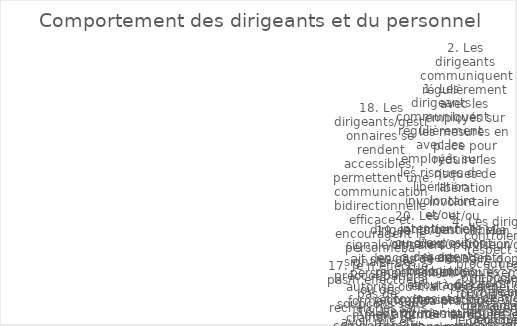
| Category | Series 0 |
|---|---|
| 1. Les dirigeants communiquent régulièrement avec les employés sur les risques de libération involontaire et/ou intentionnelle ou d’exposition à des agents biologiques et/ou à des toxines stockés ou manipulés dans mon installation. | 1 |
| 2. Les dirigeants communiquent régulièrement avec les employés sur les mesures en place pour réduire les risques de libération involontaire et/ou intentionnelle ou d’exposition à des agents biologiques et/ou à des toxines stockés ou manipulés dans mon ins | 5 |
| 3. Mon superviseur/gestionnaire donne un bon exemple personnel de pratiques visant à réduire les risques biologiques. | 5 |
| 4. Les dirigeants contrôlent le respect des procédures (ou protocoles de recherche) et des règles de conduite approuvées/validées. | 2 |
| 5. Les dirigeants fournissent les moyens nécessaires pour mettre en œuvre des mesures de biosécurité et de biosûreté. | 3 |
| 6. Les dirigeants de mon organisation encouragent les employés à accroître leur éducation et leur sensibilisation aux risques biologiques. | 0 |
| 7. Je suis convaincu que je peux déclarer moi-même une maladie ou d’autres conditions susceptibles d’affecter la biosécurité/biosûreté sans crainte de perdre mon emploi ni d’autres effets négatifs sur ma vie professionnelle/ma carrière.  | 2 |
| 8. Il n’est jamais approprié de suivre (« ferroutage ») un employé autorisé à entrer dans une zone réglementée. | 5 |
| 9. Je signale/signalerait un comportement inhabituel de mes collègues qui augmente le risque de libération involontaire et/ou intentionnelle d’agents biologiques et/ou de toxines, ou d’exposition à ces agents. | 5 |
| 10. Je suis engagé dans les processus d’évaluation des risques et de prise de décision pour réduire le risque de libération involontaire et/ou intentionnelle d’agents biologiques et/ou de toxines stockés ou manipulés dans mon installation. | 1 |
| 11. Mon organisation valorise la vigilance en matière de biosécurité et de biosûreté. | 1 |
| 12. Dans mon organisation, des mesures sont en place pour punir les violations délibérées de la biosécurité et de la biosûreté. | 2 |
| 13. Les dirigeants communiquent avec le personnel sur les attentes de performance spécifiques dans les domaines qui affectent la biosécurité et la biosûreté. | 5 |
| 14. Les employés participent aux processus d’évaluation des risques et de prise de décision et aux autres activités qui les concernent.  | 5 |
| 15. Tout le monde dans mon installation dispose correctement des matériaux contaminés. | 4 |
| 16. Un comportement qui améliore la culture de biosécurité et de biosûreté est renforcé par mes pairs. | 5 |
| 17. Je n’effectue pas/n’effectuerai pas de recherches sans avoir mis en place des mesures appropriées d’atténuation de risques. | 2 |
| 18. Les dirigeants/gestionnaires se rendent accessibles, permettent une communication bidirectionnelle efficace et encouragent le personnel à signaler des préoccupations ou des soupçons sans craindre de subir par la suite des mesures disciplinaires4. | 0 |
| 19. Je signale/signalerait des cas de personnel non autorisé ou mal formé/insuffisamment formé accédant à l’établissement.  | 2 |
| 20. Les dirigeants/gestionnaires encouragent, reconnaissent et récompensent les attitudes et comportements louables. | 4 |